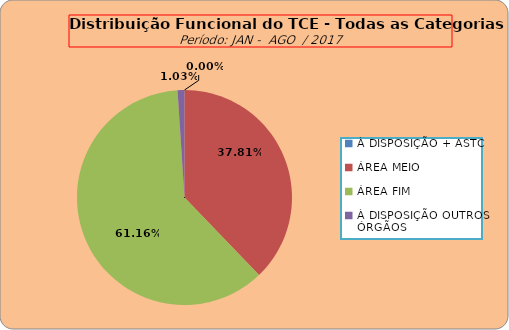
| Category | Series 0 |
|---|---|
| À DISPOSIÇÃO + ASTC | 0 |
| ÁREA MEIO | 183 |
| ÁREA FIM | 296 |
| À DISPOSIÇÃO OUTROS ÓRGÃOS | 5 |